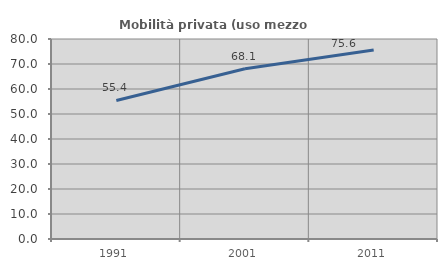
| Category | Mobilità privata (uso mezzo privato) |
|---|---|
| 1991.0 | 55.424 |
| 2001.0 | 68.078 |
| 2011.0 | 75.582 |